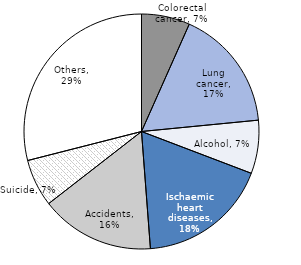
| Category | Series 0 |
|---|---|
| Colorectal cancer | 0.067 |
| Lung cancer | 0.168 |
| Alcohol | 0.073 |
| Ischaemic heart diseases | 0.18 |
| Accidents | 0.157 |
| Suicide | 0.065 |
| Others | 0.29 |